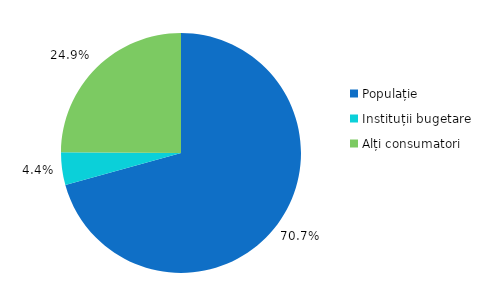
| Category | Series 0 |
|---|---|
| Populație | 0.707 |
| Instituții bugetare | 0.044 |
| Alți consumatori | 0.249 |